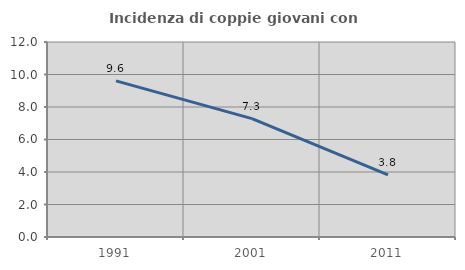
| Category | Incidenza di coppie giovani con figli |
|---|---|
| 1991.0 | 9.605 |
| 2001.0 | 7.285 |
| 2011.0 | 3.817 |